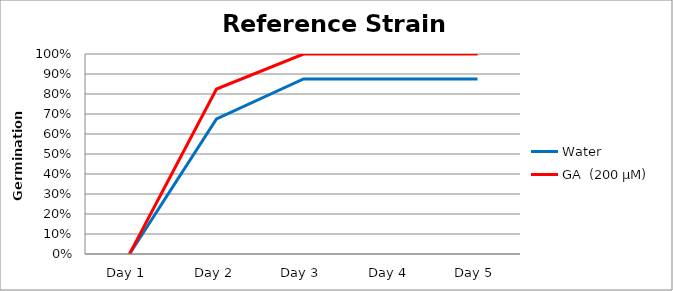
| Category | Water | GA  (200 µM)  |
|---|---|---|
| Day 1 | 0 | 0 |
| Day 2 | 0.675 | 0.825 |
| Day 3 | 0.875 | 1 |
| Day 4 | 0.875 | 1 |
| Day 5 | 0.875 | 1 |